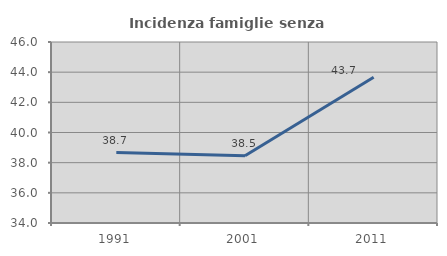
| Category | Incidenza famiglie senza nuclei |
|---|---|
| 1991.0 | 38.671 |
| 2001.0 | 38.462 |
| 2011.0 | 43.667 |